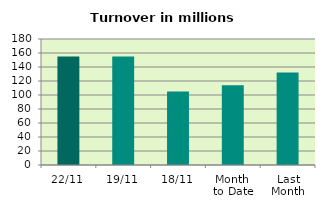
| Category | Series 0 |
|---|---|
| 22/11 | 154.855 |
| 19/11 | 155.006 |
| 18/11 | 105.153 |
| Month 
to Date | 113.782 |
| Last
Month | 132.268 |